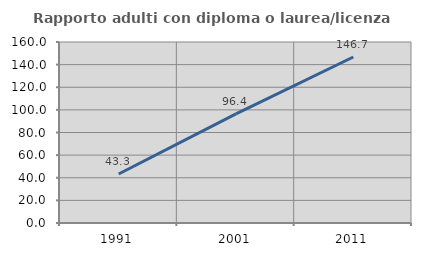
| Category | Rapporto adulti con diploma o laurea/licenza media  |
|---|---|
| 1991.0 | 43.333 |
| 2001.0 | 96.438 |
| 2011.0 | 146.726 |